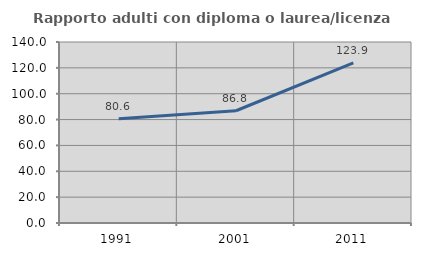
| Category | Rapporto adulti con diploma o laurea/licenza media  |
|---|---|
| 1991.0 | 80.645 |
| 2001.0 | 86.826 |
| 2011.0 | 123.926 |